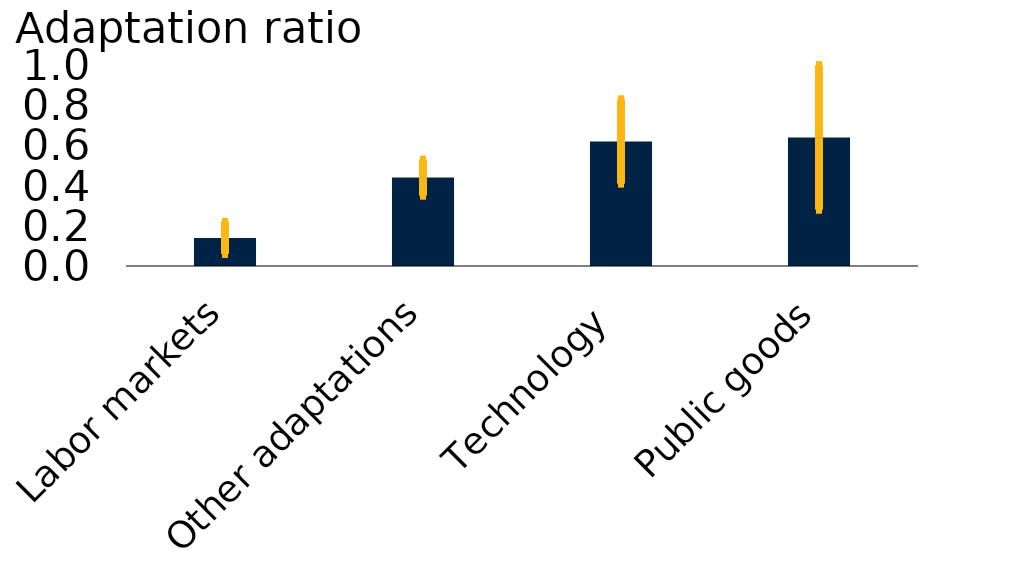
| Category | Series 0 |
|---|---|
| Labor markets | 0.14 |
| Other adaptations | 0.44 |
| Technology | 0.62 |
| Public goods | 0.64 |